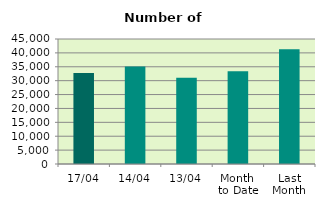
| Category | Series 0 |
|---|---|
| 17/04 | 32730 |
| 14/04 | 35080 |
| 13/04 | 31064 |
| Month 
to Date | 33414.667 |
| Last
Month | 41301.217 |